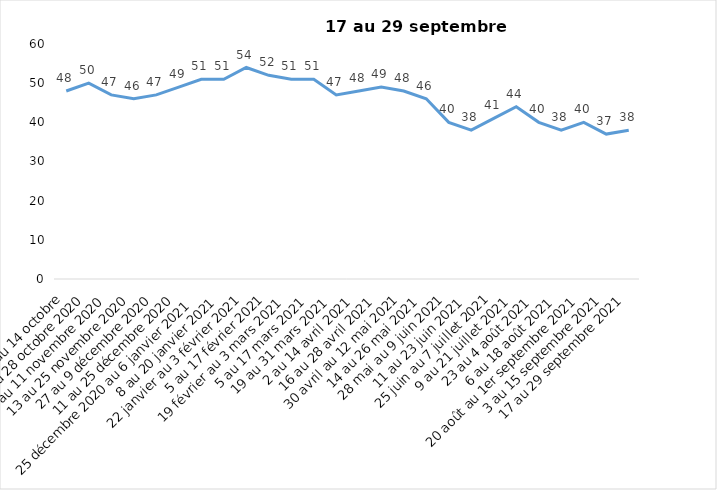
| Category | Toujours aux trois mesures |
|---|---|
| 2 au 14 octobre | 48 |
| 16 au 28 octobre 2020 | 50 |
| 30 octobre au 11 novembre 2020 | 47 |
| 13 au 25 novembre 2020 | 46 |
| 27 au 9 décembre 2020 | 47 |
| 11 au 25 décembre 2020 | 49 |
| 25 décembre 2020 au 6 janvier 2021 | 51 |
| 8 au 20 janvier 2021 | 51 |
| 22 janvier au 3 février 2021 | 54 |
| 5 au 17 février 2021 | 52 |
| 19 février au 3 mars 2021 | 51 |
| 5 au 17 mars 2021 | 51 |
| 19 au 31 mars 2021 | 47 |
| 2 au 14 avril 2021 | 48 |
| 16 au 28 avril 2021 | 49 |
| 30 avril au 12 mai 2021 | 48 |
| 14 au 26 mai 2021 | 46 |
| 28 mai au 9 juin 2021 | 40 |
| 11 au 23 juin 2021 | 38 |
| 25 juin au 7 juillet 2021 | 41 |
| 9 au 21 juillet 2021 | 44 |
| 23 au 4 août 2021 | 40 |
| 6 au 18 août 2021 | 38 |
| 20 août au 1er septembre 2021 | 40 |
| 3 au 15 septembre 2021 | 37 |
| 17 au 29 septembre 2021 | 38 |